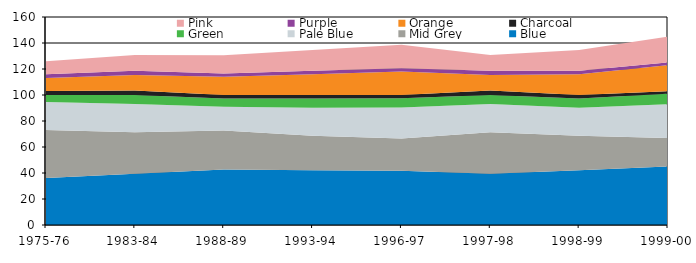
| Category | Blue | Mid Grey | Pale Blue | Green | Charcoal | Orange | Purple | Pink |
|---|---|---|---|---|---|---|---|---|
| 1975-76 | 36.19 | 36.88 | 21.56 | 5.36 | 3.01 | 10 | 3.01 | 10 |
| 1983-84 | 39.39 | 32.02 | 21.6 | 7.01 | 3.36 | 12 | 3.36 | 12 |
| 1988-89 | 42.78 | 29.91 | 18.35 | 6.33 | 2.63 | 14 | 2.63 | 14 |
| 1993-94 | 42.13 | 26.53 | 21.6 | 7.01 | 2.72 | 16 | 2.72 | 16 |
| 1996-97 | 41.69 | 24.76 | 23.98 | 7 | 2.57 | 18 | 2.57 | 18 |
| 1997-98 | 39.39 | 32.02 | 21.6 | 7.01 | 3.36 | 12 | 3.36 | 12 |
| 1998-99 | 42.13 | 26.53 | 21.6 | 7.01 | 2.72 | 16 | 2.72 | 16 |
| 1999-00 | 45 | 22 | 26 | 8 | 2 | 20 | 2 | 20 |